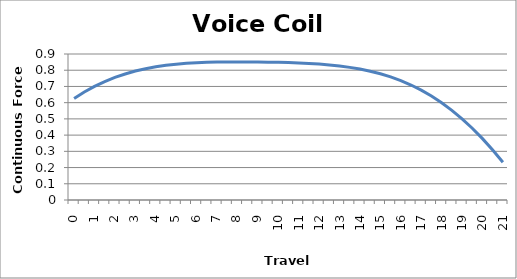
| Category | Series 0 |
|---|---|
| 0.0 | 0.626 |
| 0.5 | 0.666 |
| 1.0 | 0.7 |
| 1.5 | 0.73 |
| 2.0 | 0.756 |
| 2.5 | 0.777 |
| 3.0 | 0.795 |
| 3.5 | 0.809 |
| 4.0 | 0.821 |
| 4.5 | 0.83 |
| 5.0 | 0.837 |
| 5.5 | 0.842 |
| 6.0 | 0.846 |
| 6.5 | 0.849 |
| 7.0 | 0.85 |
| 7.5 | 0.851 |
| 8.0 | 0.851 |
| 8.5 | 0.851 |
| 9.0 | 0.851 |
| 9.5 | 0.85 |
| 10.0 | 0.849 |
| 10.5 | 0.847 |
| 11.0 | 0.845 |
| 11.5 | 0.842 |
| 12.0 | 0.838 |
| 12.5 | 0.833 |
| 13.0 | 0.826 |
| 13.5 | 0.817 |
| 14.0 | 0.807 |
| 14.5 | 0.794 |
| 15.0 | 0.778 |
| 15.5 | 0.759 |
| 16.0 | 0.736 |
| 16.5 | 0.709 |
| 17.0 | 0.677 |
| 17.5 | 0.641 |
| 18.0 | 0.6 |
| 18.5 | 0.553 |
| 19.0 | 0.5 |
| 19.5 | 0.442 |
| 20.0 | 0.378 |
| 20.5 | 0.308 |
| 21.0 | 0.233 |